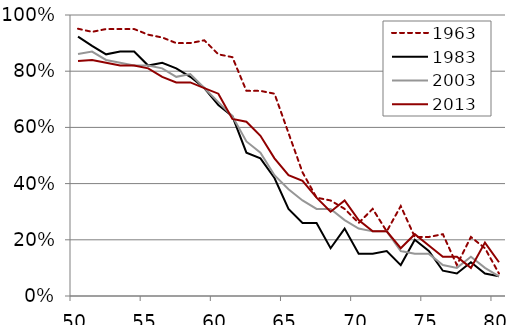
| Category | 1963 | 1983 | 2003 | 2013 |
|---|---|---|---|---|
| 50.0 | 95.11 | 92.32 | 86.13 | 83.66 |
| 51.0 | 94 | 89 | 87 | 84 |
| 52.0 | 95 | 86 | 84 | 83 |
| 53.0 | 95 | 87 | 83 | 82 |
| 54.0 | 95 | 87 | 82 | 82 |
| 55.0 | 93 | 82 | 82 | 81 |
| 56.0 | 92 | 83 | 81 | 78 |
| 57.0 | 90 | 81 | 78 | 76 |
| 58.0 | 90 | 78 | 79 | 76 |
| 59.0 | 91 | 74 | 74 | 74 |
| 60.0 | 86 | 68 | 69 | 72 |
| 61.0 | 85 | 64 | 64 | 63 |
| 62.0 | 73 | 51 | 55 | 62 |
| 63.0 | 73 | 49 | 51 | 57 |
| 64.0 | 72 | 42 | 43 | 49 |
| 65.0 | 58 | 31 | 38 | 43 |
| 66.0 | 44 | 26 | 34 | 41 |
| 67.0 | 35 | 26 | 31 | 35 |
| 68.0 | 34 | 17 | 31 | 30 |
| 69.0 | 31 | 24 | 27 | 34 |
| 70.0 | 26 | 15 | 24 | 27 |
| 71.0 | 31 | 15 | 23 | 23 |
| 72.0 | 23 | 16 | 23 | 23 |
| 73.0 | 32 | 11 | 16 | 17 |
| 74.0 | 21 | 20 | 15 | 22 |
| 75.0 | 21 | 16 | 15 | 18 |
| 76.0 | 22 | 9 | 11 | 14 |
| 77.0 | 11 | 8 | 10 | 14 |
| 78.0 | 21 | 12 | 14 | 10 |
| 79.0 | 17 | 8 | 10 | 19 |
| 80.0 | 8 | 7 | 7 | 12 |